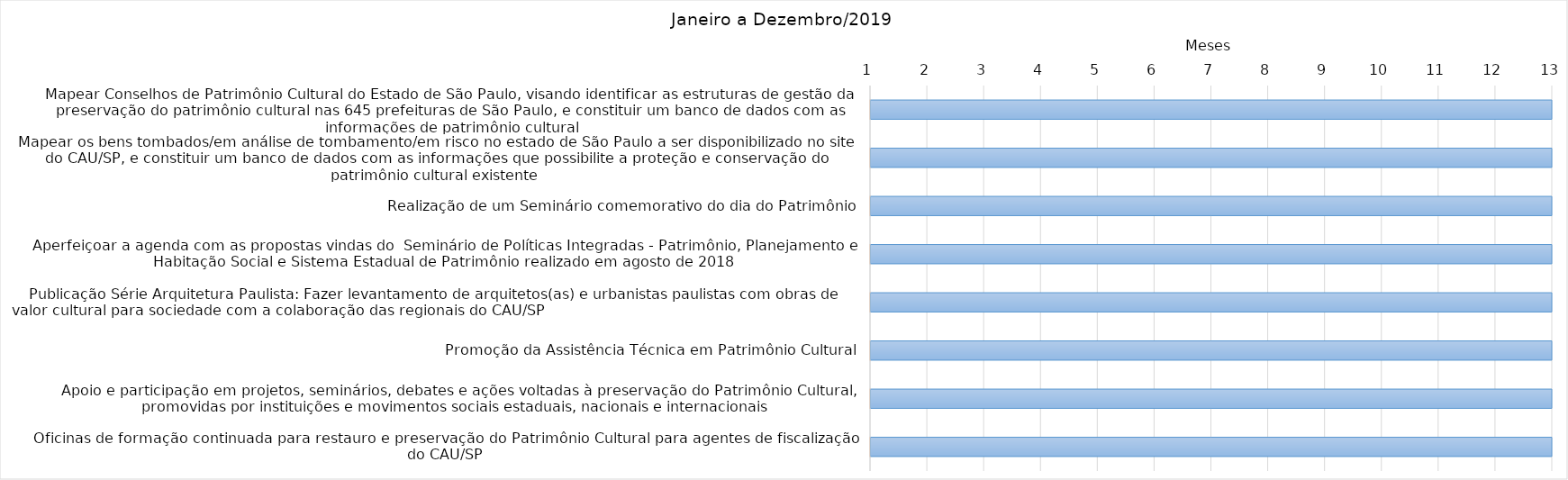
| Category | Início | Duração |
|---|---|---|
| Mapear Conselhos de Patrimônio Cultural do Estado de São Paulo, visando identificar as estruturas de gestão da preservação do patrimônio cultural nas 645 prefeituras de São Paulo, e constituir um banco de dados com as informações de patrimônio cultural | 1 | 12 |
| Mapear os bens tombados/em análise de tombamento/em risco no estado de São Paulo a ser disponibilizado no site do CAU/SP, e constituir um banco de dados com as informações que possibilite a proteção e conservação do patrimônio cultural existente  | 1 | 12 |
| Realização de um Seminário comemorativo do dia do Patrimônio | 1 | 12 |
| Aperfeiçoar a agenda com as propostas vindas do  Seminário de Políticas Integradas - Patrimônio, Planejamento e Habitação Social e Sistema Estadual de Patrimônio realizado em agosto de 2018 | 1 | 12 |
| Publicação Série Arquitetura Paulista: Fazer levantamento de arquitetos(as) e urbanistas paulistas com obras de valor cultural para sociedade com a colaboração das regionais do CAU/SP                                                                         | 1 | 12 |
| Promoção da Assistência Técnica em Patrimônio Cultural | 1 | 12 |
|  Apoio e participação em projetos, seminários, debates e ações voltadas à preservação do Patrimônio Cultural, promovidas por instituições e movimentos sociais estaduais, nacionais e internacionais | 1 | 12 |
| Oficinas de formação continuada para restauro e preservação do Patrimônio Cultural para agentes de fiscalização do CAU/SP | 1 | 12 |